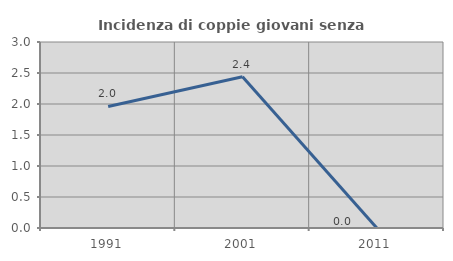
| Category | Incidenza di coppie giovani senza figli |
|---|---|
| 1991.0 | 1.961 |
| 2001.0 | 2.439 |
| 2011.0 | 0 |